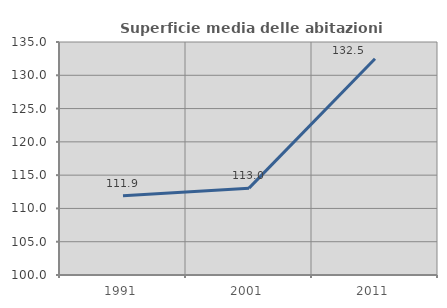
| Category | Superficie media delle abitazioni occupate |
|---|---|
| 1991.0 | 111.898 |
| 2001.0 | 113.045 |
| 2011.0 | 132.493 |